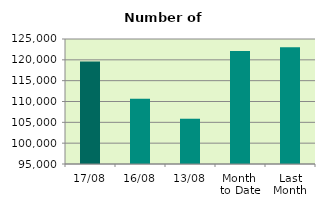
| Category | Series 0 |
|---|---|
| 17/08 | 119626 |
| 16/08 | 110656 |
| 13/08 | 105864 |
| Month 
to Date | 122140 |
| Last
Month | 122991 |